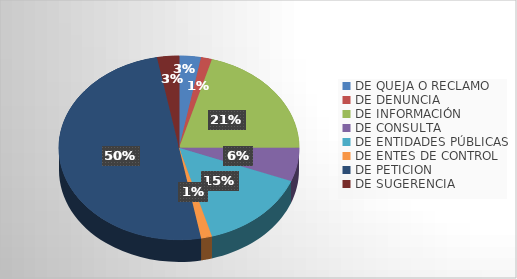
| Category | Series 0 |
|---|---|
| DE QUEJA O RECLAMO | 2 |
| DE DENUNCIA | 1 |
| DE INFORMACIÓN | 14 |
| DE CONSULTA | 4 |
| DE ENTIDADES PÚBLICAS | 10 |
| DE ENTES DE CONTROL | 1 |
| DE PETICION | 34 |
| DE SUGERENCIA | 2 |